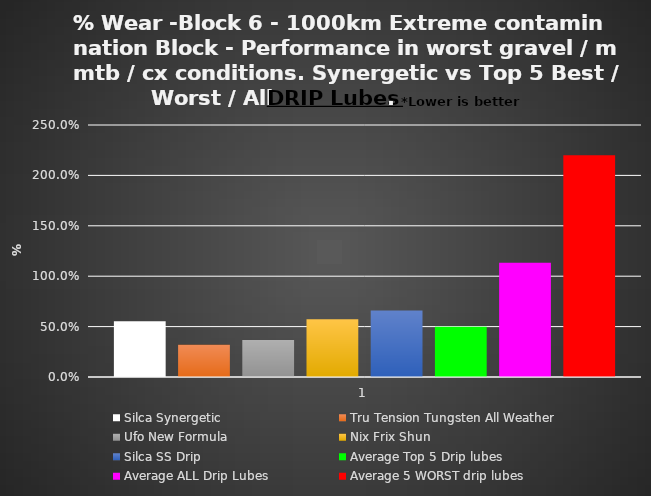
| Category | Silca Synergetic | Tru Tension Tungsten All Weather | Ufo New Formula | Nix Frix Shun | Silca SS Drip | Average Top 5 Drip lubes | Average ALL Drip Lubes | Average 5 WORST drip lubes |
|---|---|---|---|---|---|---|---|---|
| 0 | 0.553 | 0.32 | 0.366 | 0.572 | 0.66 | 0.499 | 1.134 | 2.2 |